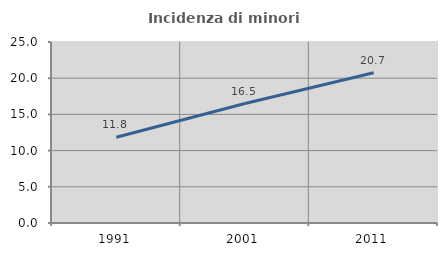
| Category | Incidenza di minori stranieri |
|---|---|
| 1991.0 | 11.842 |
| 2001.0 | 16.5 |
| 2011.0 | 20.747 |